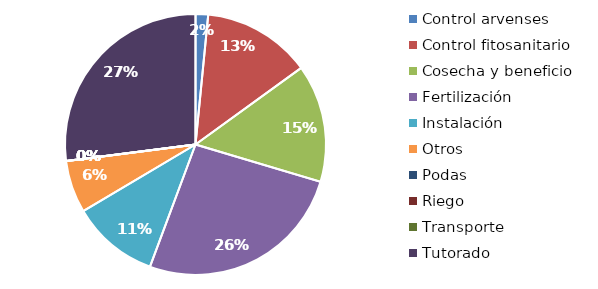
| Category | Valor |
|---|---|
| Control arvenses | 263144 |
| Control fitosanitario | 2274963 |
| Cosecha y beneficio | 2466132.967 |
| Fertilización | 4403937 |
| Instalación | 1826765.161 |
| Otros | 1096060 |
| Podas | 0 |
| Riego | 0 |
| Transporte | 0 |
| Tutorado | 4566913 |